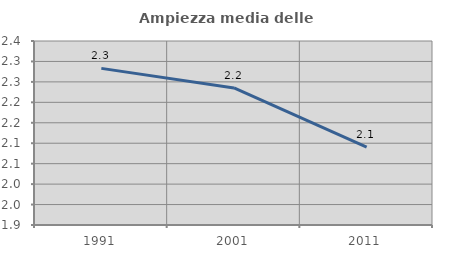
| Category | Ampiezza media delle famiglie |
|---|---|
| 1991.0 | 2.283 |
| 2001.0 | 2.235 |
| 2011.0 | 2.09 |